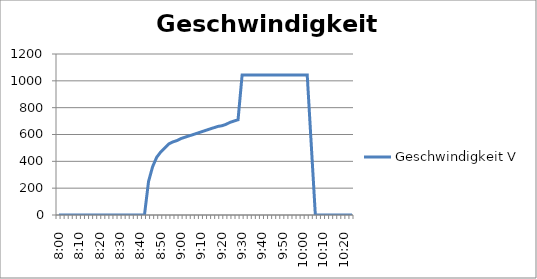
| Category | Geschwindigkeit V |
|---|---|
| 0.333333333333331 | 0 |
| 0.33472222222222 | 0 |
| 0.336111111111109 | 0 |
| 0.337499999999998 | 0 |
| 0.338888888888887 | 0 |
| 0.340277777777776 | 0 |
| 0.341666666666665 | 0 |
| 0.343055555555554 | 0 |
| 0.344444444444443 | 0 |
| 0.345833333333332 | 0 |
| 0.347222222222221 | 0 |
| 0.34861111111111 | 0 |
| 0.349999999999999 | 0 |
| 0.351388888888888 | 0 |
| 0.352777777777777 | 0 |
| 0.354166666666666 | 0 |
| 0.355555555555555 | 0 |
| 0.356944444444444 | 0 |
| 0.358333333333333 | 0 |
| 0.359722222222222 | 0 |
| 0.361111111111111 | 0 |
| 0.3625 | 0 |
| 0.363888888888889 | 250 |
| 0.365277777777778 | 360 |
| 0.366666666666666 | 430 |
| 0.368055555555555 | 470 |
| 0.369444444444444 | 500 |
| 0.370833333333333 | 530 |
| 0.372222222222222 | 545 |
| 0.373611111111111 | 555 |
| 0.375 | 570 |
| 0.376388888888889 | 580 |
| 0.377777777777778 | 590 |
| 0.379166666666666 | 600 |
| 0.380555555555555 | 610 |
| 0.381944444444444 | 620 |
| 0.383333333333333 | 630 |
| 0.384722222222222 | 640 |
| 0.386111111111111 | 650 |
| 0.3875 | 660 |
| 0.388888888888889 | 665 |
| 0.390277777777778 | 675 |
| 0.391666666666667 | 690 |
| 0.393055555555556 | 700 |
| 0.394444444444445 | 710 |
| 0.3958333333333333 | 1044 |
| 0.3972222222222222 | 1044 |
| 0.398611111111111 | 1044 |
| 0.4 | 1044 |
| 0.401388888888889 | 1044 |
| 0.402777777777778 | 1044 |
| 0.404166666666667 | 1044 |
| 0.405555555555556 | 1044 |
| 0.406944444444444 | 1044 |
| 0.408333333333333 | 1044 |
| 0.409722222222222 | 1044 |
| 0.411111111111111 | 1044 |
| 0.4125 | 1044 |
| 0.413888888888889 | 1044 |
| 0.415277777777778 | 1044 |
| 0.416666666666667 | 1044 |
| 0.418055555555556 | 1044 |
| 0.41944444444444445 | 522 |
| 0.420833333333334 | 0 |
| 0.422222222222223 | 0 |
| 0.423611111111112 | 0 |
| 0.425000000000001 | 0 |
| 0.42638888888889 | 0 |
| 0.427777777777779 | 0 |
| 0.429166666666668 | 0 |
| 0.430555555555557 | 0 |
| 0.431944444444446 | 0 |
| 0.433333333333335 | 0 |